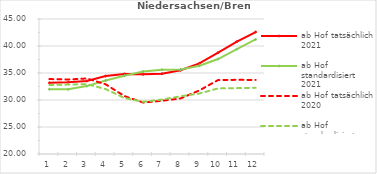
| Category | ab Hof tatsächlich 2021 | ab Hof standardisiert 2021 | ab Hof tatsächlich 2020 | ab Hof standardisiert 2020 |
|---|---|---|---|---|
| 0 | 33.181 | 31.986 | 33.879 | 32.777 |
| 1 | 33.276 | 31.978 | 33.793 | 32.856 |
| 2 | 33.532 | 32.573 | 33.988 | 32.945 |
| 3 | 34.435 | 33.6 | 32.909 | 32.024 |
| 4 | 34.821 | 34.502 | 30.729 | 30.376 |
| 5 | 34.76 | 35.263 | 29.53 | 29.667 |
| 6 | 34.859 | 35.603 | 29.857 | 30.072 |
| 7 | 35.517 | 35.642 | 30.288 | 30.694 |
| 8 | 36.777 | 36.349 | 31.777 | 31.201 |
| 9 | 38.773 | 37.588 | 33.695 | 32.153 |
| 10 | 40.805 | 39.422 | 33.734 | 32.2 |
| 11 | 42.589 | 41.211 | 33.715 | 32.251 |